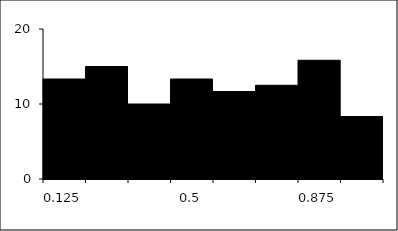
| Category | Series 1 |
|---|---|
| 0.125 | 13.333 |
| 0.25 | 15 |
| 0.375 | 10 |
| 0.5 | 13.333 |
| 0.625 | 11.667 |
| 0.75 | 12.5 |
| 0.875 | 15.833 |
| 1.0 | 8.333 |